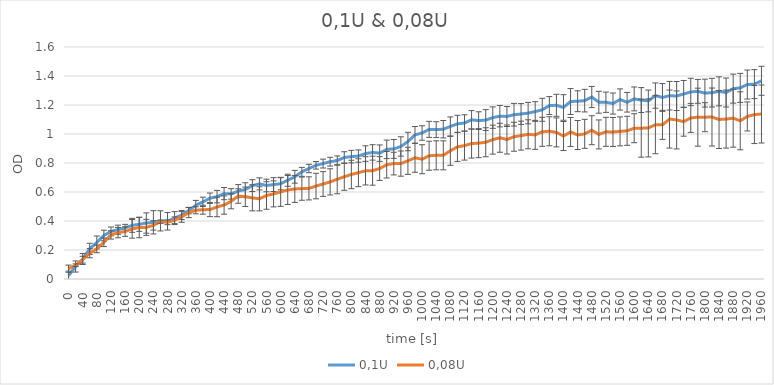
| Category | 0,1U | 0,08U |
|---|---|---|
| 0.0 | 0.023 | 0.071 |
| 20.0 | 0.086 | 0.095 |
| 40.0 | 0.138 | 0.133 |
| 60.0 | 0.208 | 0.178 |
| 80.0 | 0.252 | 0.208 |
| 100.0 | 0.3 | 0.253 |
| 120.0 | 0.328 | 0.304 |
| 140.0 | 0.34 | 0.32 |
| 160.0 | 0.353 | 0.327 |
| 180.0 | 0.37 | 0.346 |
| 200.0 | 0.377 | 0.355 |
| 220.0 | 0.386 | 0.356 |
| 240.0 | 0.391 | 0.37 |
| 260.0 | 0.401 | 0.395 |
| 280.0 | 0.398 | 0.391 |
| 300.0 | 0.42 | 0.405 |
| 320.0 | 0.441 | 0.428 |
| 340.0 | 0.472 | 0.458 |
| 360.0 | 0.509 | 0.474 |
| 380.0 | 0.532 | 0.478 |
| 400.0 | 0.557 | 0.479 |
| 420.0 | 0.568 | 0.497 |
| 440.0 | 0.589 | 0.51 |
| 460.0 | 0.587 | 0.536 |
| 480.0 | 0.606 | 0.572 |
| 500.0 | 0.617 | 0.567 |
| 520.0 | 0.644 | 0.56 |
| 540.0 | 0.656 | 0.553 |
| 560.0 | 0.645 | 0.576 |
| 580.0 | 0.651 | 0.587 |
| 600.0 | 0.657 | 0.601 |
| 620.0 | 0.681 | 0.614 |
| 640.0 | 0.705 | 0.621 |
| 660.0 | 0.739 | 0.623 |
| 680.0 | 0.762 | 0.625 |
| 700.0 | 0.784 | 0.641 |
| 720.0 | 0.796 | 0.655 |
| 740.0 | 0.809 | 0.67 |
| 760.0 | 0.817 | 0.688 |
| 780.0 | 0.838 | 0.705 |
| 800.0 | 0.844 | 0.721 |
| 820.0 | 0.848 | 0.733 |
| 840.0 | 0.865 | 0.746 |
| 860.0 | 0.873 | 0.747 |
| 880.0 | 0.868 | 0.762 |
| 900.0 | 0.894 | 0.788 |
| 920.0 | 0.897 | 0.796 |
| 940.0 | 0.914 | 0.796 |
| 960.0 | 0.948 | 0.815 |
| 980.0 | 0.994 | 0.836 |
| 1000.0 | 1.007 | 0.826 |
| 1020.0 | 1.032 | 0.85 |
| 1040.0 | 1.03 | 0.853 |
| 1060.0 | 1.033 | 0.853 |
| 1080.0 | 1.052 | 0.884 |
| 1100.0 | 1.07 | 0.911 |
| 1120.0 | 1.076 | 0.92 |
| 1140.0 | 1.098 | 0.934 |
| 1160.0 | 1.092 | 0.937 |
| 1180.0 | 1.096 | 0.943 |
| 1200.0 | 1.113 | 0.961 |
| 1220.0 | 1.123 | 0.974 |
| 1240.0 | 1.121 | 0.962 |
| 1260.0 | 1.133 | 0.981 |
| 1280.0 | 1.138 | 0.989 |
| 1300.0 | 1.144 | 0.998 |
| 1320.0 | 1.155 | 0.994 |
| 1340.0 | 1.167 | 1.015 |
| 1360.0 | 1.196 | 1.019 |
| 1380.0 | 1.198 | 1.011 |
| 1400.0 | 1.183 | 0.986 |
| 1420.0 | 1.224 | 1.014 |
| 1440.0 | 1.226 | 0.993 |
| 1460.0 | 1.23 | 1.001 |
| 1480.0 | 1.255 | 1.026 |
| 1500.0 | 1.219 | 0.997 |
| 1520.0 | 1.219 | 1.015 |
| 1540.0 | 1.21 | 1.014 |
| 1560.0 | 1.238 | 1.018 |
| 1580.0 | 1.219 | 1.022 |
| 1600.0 | 1.242 | 1.04 |
| 1620.0 | 1.234 | 1.04 |
| 1640.0 | 1.228 | 1.042 |
| 1660.0 | 1.265 | 1.064 |
| 1680.0 | 1.252 | 1.063 |
| 1700.0 | 1.264 | 1.103 |
| 1720.0 | 1.262 | 1.097 |
| 1740.0 | 1.276 | 1.085 |
| 1760.0 | 1.29 | 1.111 |
| 1780.0 | 1.294 | 1.116 |
| 1800.0 | 1.282 | 1.116 |
| 1820.0 | 1.285 | 1.117 |
| 1840.0 | 1.294 | 1.1 |
| 1860.0 | 1.286 | 1.103 |
| 1880.0 | 1.313 | 1.109 |
| 1900.0 | 1.318 | 1.091 |
| 1920.0 | 1.341 | 1.121 |
| 1940.0 | 1.344 | 1.134 |
| 1960.0 | 1.367 | 1.138 |